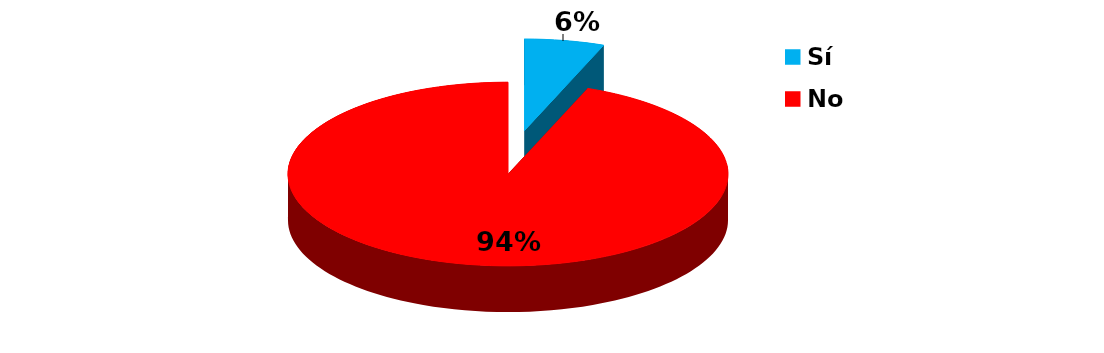
| Category | Series 0 |
|---|---|
| Sí | 1 |
| No | 16 |